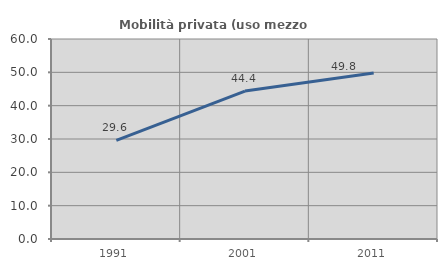
| Category | Mobilità privata (uso mezzo privato) |
|---|---|
| 1991.0 | 29.606 |
| 2001.0 | 44.37 |
| 2011.0 | 49.769 |